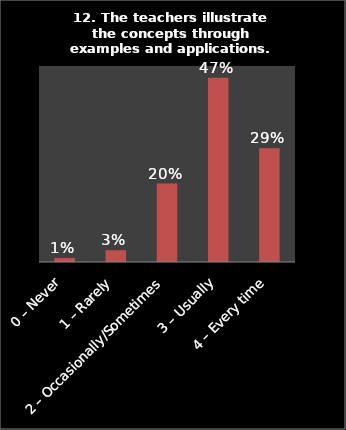
| Category | Series 0 |
|---|---|
| 0 – Never | 0.01 |
| 1 – Rarely | 0.03 |
| 2 – Occasionally/Sometimes | 0.2 |
| 3 – Usually | 0.47 |
| 4 – Every time | 0.29 |